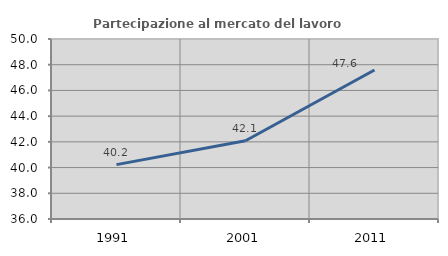
| Category | Partecipazione al mercato del lavoro  femminile |
|---|---|
| 1991.0 | 40.23 |
| 2001.0 | 42.084 |
| 2011.0 | 47.585 |